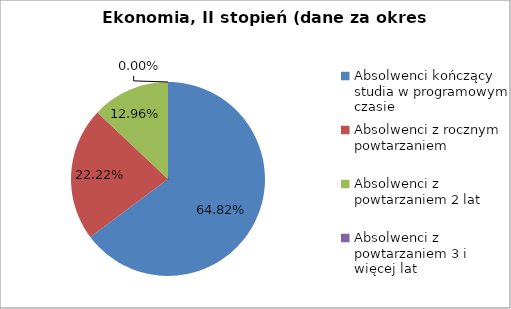
| Category | Series 0 |
|---|---|
| Absolwenci kończący studia w programowym czasie | 64.815 |
| Absolwenci z rocznym powtarzaniem | 22.222 |
| Absolwenci z powtarzaniem 2 lat | 12.963 |
| Absolwenci z powtarzaniem 3 i więcej lat | 0 |